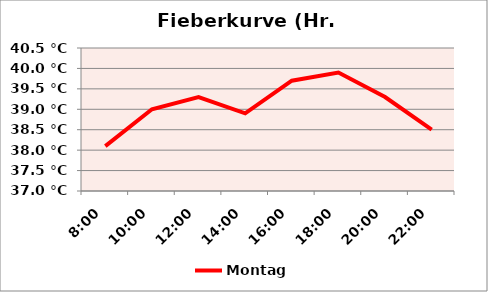
| Category | Montag |
|---|---|
| 0.3333333333333333 | 38.1 |
| 0.4166666666666667 | 39 |
| 0.5 | 39.3 |
| 0.583333333333333 | 38.9 |
| 0.666666666666666 | 39.7 |
| 0.75 | 39.9 |
| 0.833333333333333 | 39.3 |
| 0.916666666666667 | 38.5 |